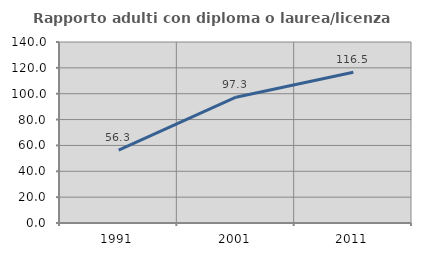
| Category | Rapporto adulti con diploma o laurea/licenza media  |
|---|---|
| 1991.0 | 56.293 |
| 2001.0 | 97.302 |
| 2011.0 | 116.535 |